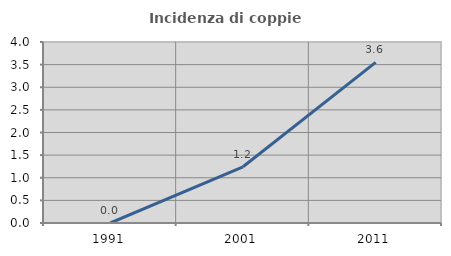
| Category | Incidenza di coppie miste |
|---|---|
| 1991.0 | 0 |
| 2001.0 | 1.242 |
| 2011.0 | 3.55 |